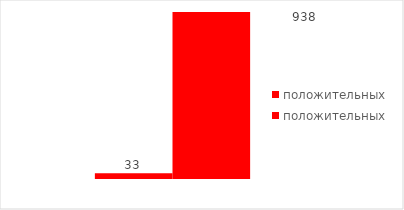
| Category | положительных |
|---|---|
| 0 | 938 |